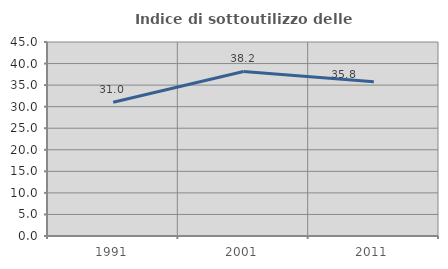
| Category | Indice di sottoutilizzo delle abitazioni  |
|---|---|
| 1991.0 | 31.01 |
| 2001.0 | 38.164 |
| 2011.0 | 35.759 |